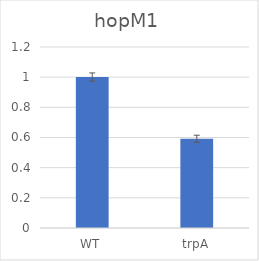
| Category | Series 0 |
|---|---|
| WT | 1.001 |
| trpA | 0.591 |